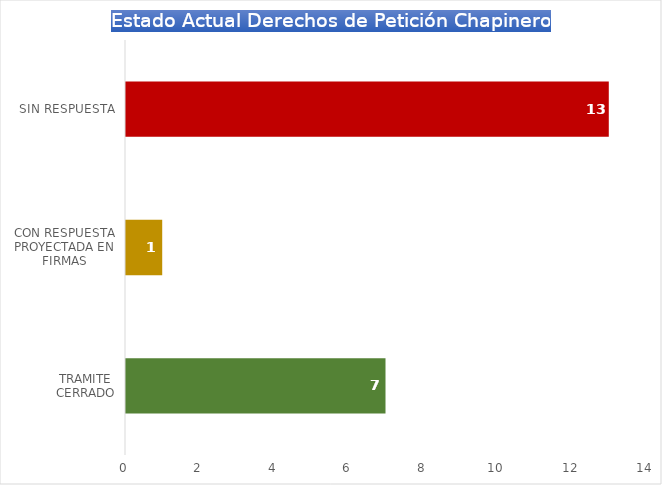
| Category | Series 0 |
|---|---|
| TRAMITE CERRADO | 7 |
| CON RESPUESTA PROYECTADA EN FIRMAS | 1 |
| SIN RESPUESTA | 13 |